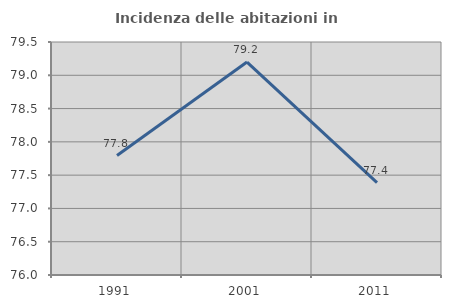
| Category | Incidenza delle abitazioni in proprietà  |
|---|---|
| 1991.0 | 77.795 |
| 2001.0 | 79.198 |
| 2011.0 | 77.386 |